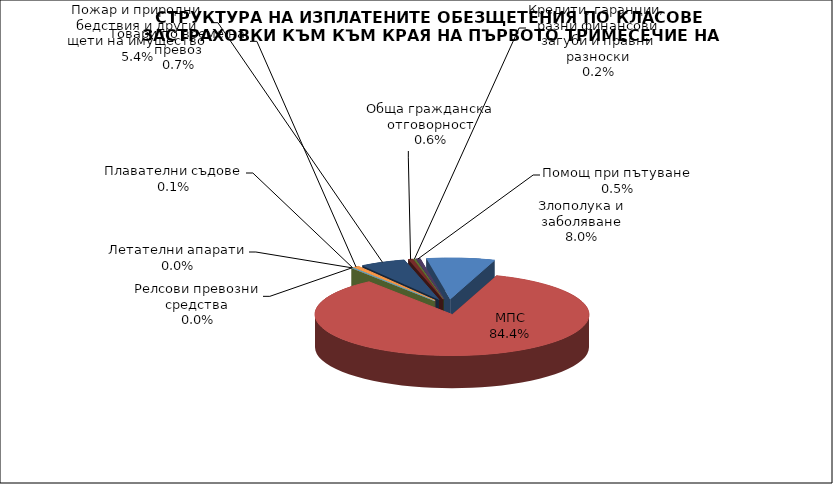
| Category | Злополука и заболяване |
|---|---|
| Злополука и заболяване | 0.08 |
| МПС | 0.844 |
| Релсови превозни средства | 0 |
| Летателни апарати | 0 |
| Плавателни съдове | 0.001 |
| Товари по време на превоз | 0.007 |
| Пожар и природни бедствия и други щети на имущество | 0.054 |
| Обща гражданска отговорност | 0.006 |
| Кредити, гаранции, разни финансови загуби и правни разноски | 0.002 |
| Помощ при пътуване | 0.005 |